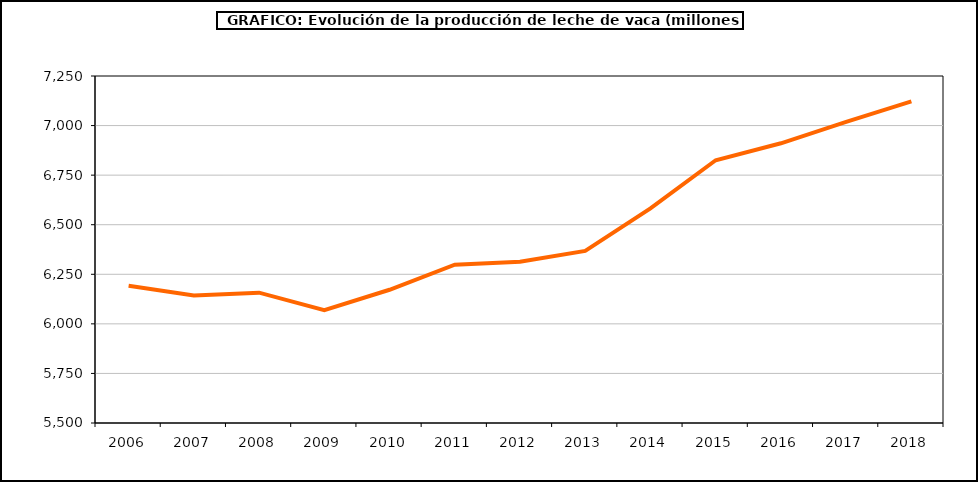
| Category | leche vaca |
|---|---|
| 2006.0 | 6191.682 |
| 2007.0 | 6143.128 |
| 2008.0 | 6157.188 |
| 2009.0 | 6069.364 |
| 2010.0 | 6171.9 |
| 2011.0 | 6298.47 |
| 2012.0 | 6313.014 |
| 2013.0 | 6368.131 |
| 2014.0 | 6582.284 |
| 2015.0 | 6825.141 |
| 2016.0 | 6910.608 |
| 2017.0 | 7018.786 |
| 2018.0 | 7121.965 |